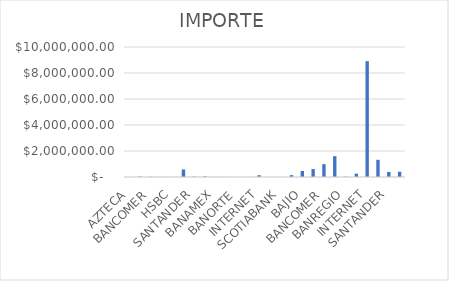
| Category | IMPORTE |
|---|---|
| AZTECA | 3043.56 |
| BANAMEX | 35892.95 |
| BANCOMER | 22801.46 |
| BANORTE | 8067.2 |
| HSBC | 4941.82 |
| INTERNET | 582758.64 |
| SANTANDER | 26685.7 |
| ESTAC.BANORTE | 47235 |
| BANAMEX | 11605 |
| BANCOMER | 4035 |
| BANORTE | 600 |
| HSBC | 6627.8 |
| INTERNET | 137642.68 |
| SANTANDER | 900 |
| SCOTIABANK | 300 |
| AZTECA | 140341.48 |
| BAJIO | 460939.54 |
| BANAMEX | 609557.7 |
| BANCOMER | 988972.22 |
| BANORTE | 1600726.62 |
| BANREGIO | 25130.88 |
| HSBC | 257572.98 |
| INTERNET | 8912590.19 |
| OXXO | 1322278.98 |
| SANTANDER | 389340.11 |
| SCOTIABANK | 404819.58 |